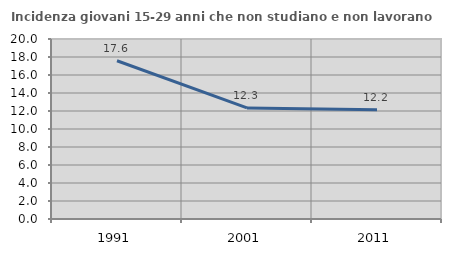
| Category | Incidenza giovani 15-29 anni che non studiano e non lavorano  |
|---|---|
| 1991.0 | 17.582 |
| 2001.0 | 12.341 |
| 2011.0 | 12.151 |